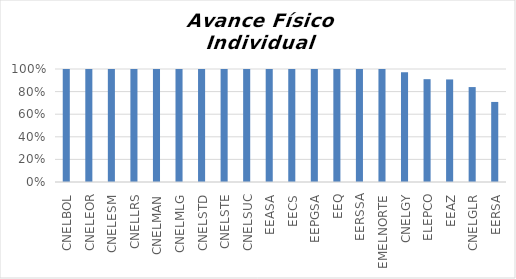
| Category | Avance % |
|---|---|
| CNELBOL | 1 |
| CNELEOR | 1 |
| CNELESM | 1 |
| CNELLRS | 1 |
| CNELMAN | 1 |
| CNELMLG | 1 |
| CNELSTD | 1 |
| CNELSTE | 1 |
| CNELSUC | 1 |
| EEASA | 1 |
| EECS | 1 |
| EEPGSA | 1 |
| EEQ | 1 |
| EERSSA | 1 |
| EMELNORTE | 1 |
| CNELGY | 0.972 |
| ELEPCO | 0.91 |
| EEAZ | 0.908 |
| CNELGLR | 0.84 |
| EERSA | 0.708 |